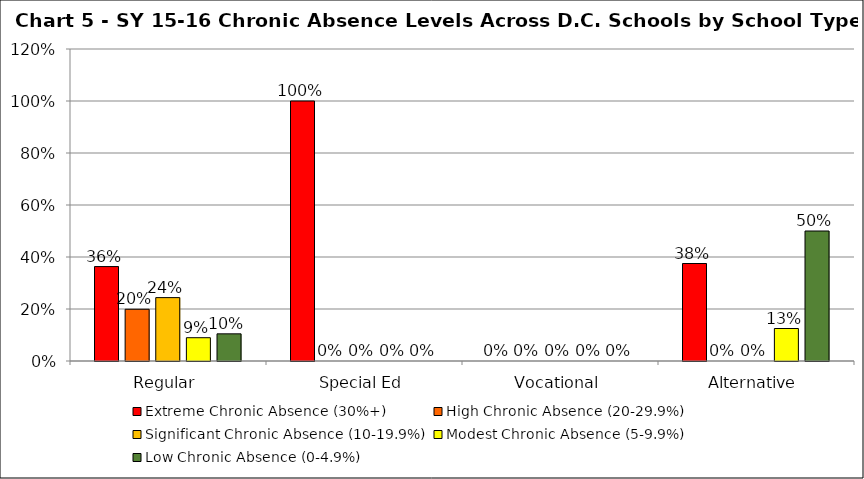
| Category | Extreme Chronic Absence (30%+) | High Chronic Absence (20-29.9%) | Significant Chronic Absence (10-19.9%) | Modest Chronic Absence (5-9.9%) | Low Chronic Absence (0-4.9%) |
|---|---|---|---|---|---|
| 0 | 0.363 | 0.199 | 0.244 | 0.09 | 0.104 |
| 1 | 1 | 0 | 0 | 0 | 0 |
| 2 | 0 | 0 | 0 | 0 | 0 |
| 3 | 0.375 | 0 | 0 | 0.125 | 0.5 |